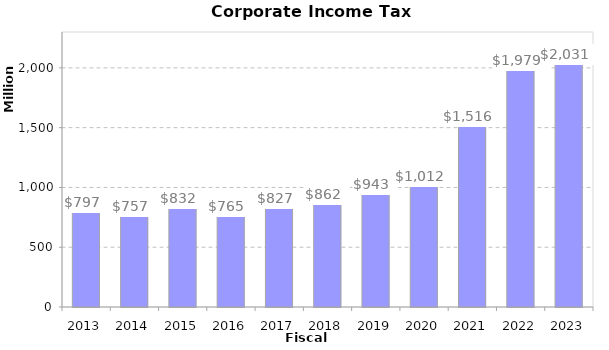
| Category | Amount |
|---|---|
| 2013.0 | 796728154.4 |
| 2014.0 | 757490742.09 |
| 2015.0 | 831906887.16 |
| 2016.0 | 764948013.77 |
| 2017.0 | 826960822.31 |
| 2018.0 | 861897138.18 |
| 2019.0 | 943390660.95 |
| 2020.0 | 1011649618.07 |
| 2021.0 | 1515692110.65 |
| 2022.0 | 1978697205.29 |
| 2023.0 | 2031120170.6 |